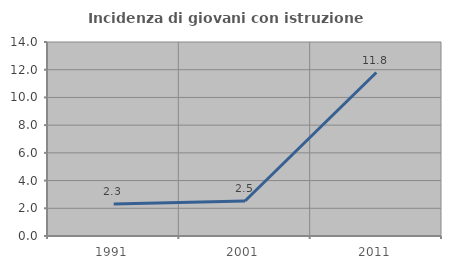
| Category | Incidenza di giovani con istruzione universitaria |
|---|---|
| 1991.0 | 2.304 |
| 2001.0 | 2.525 |
| 2011.0 | 11.798 |